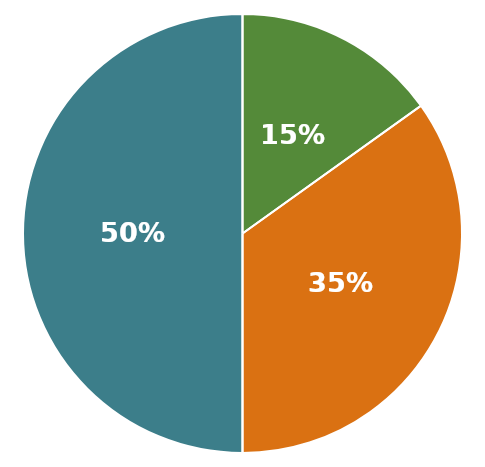
| Category | Totale Attività |
|---|---|
| 0 | 1902500 |
| 1 | 575000 |
| 2 | 1327500 |